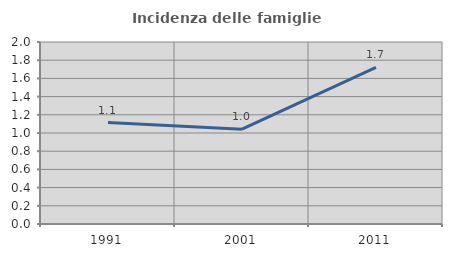
| Category | Incidenza delle famiglie numerose |
|---|---|
| 1991.0 | 1.115 |
| 2001.0 | 1.042 |
| 2011.0 | 1.722 |